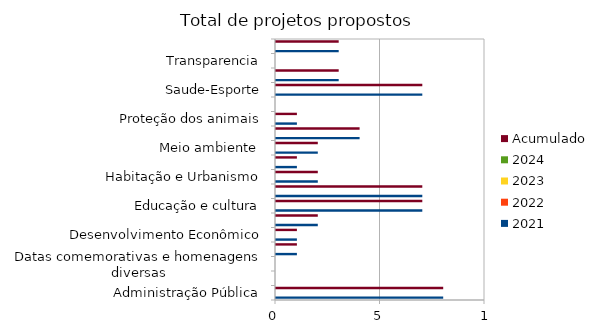
| Category | 2021 | 2022 | 2023 | 2024 | Acumulado |
|---|---|---|---|---|---|
| Administração Pública | 8 |  |  |  | 8 |
| Combate à corrupção  | 0 |  |  |  | 0 |
| Datas comemorativas e homenagens diversas | 0 |  |  |  | 0 |
| Denominação de logradouro | 1 |  |  |  | 1 |
| Desenvolvimento Econômico | 1 |  |  |  | 1 |
| Desenvolvimento Social  | 2 |  |  |  | 2 |
| Educação e cultura | 7 |  |  |  | 7 |
| Frente parlamentar | 7 |  |  |  | 7 |
| Habitação e Urbanismo | 2 |  |  |  | 2 |
| Lei Orgânica do Município | 1 |  |  |  | 1 |
| Meio ambiente  | 2 |  |  |  | 2 |
| Mobilidade | 4 |  |  |  | 4 |
| Proteção dos animais | 1 |  |  |  | 1 |
| Regimento Interno da CMSP | 0 |  |  |  | 0 |
| Saude-Esporte | 7 |  |  |  | 7 |
| Segurança Pública | 3 |  |  |  | 3 |
| Transparencia | 0 |  |  |  | 0 |
| Tributação | 3 |  |  |  | 3 |